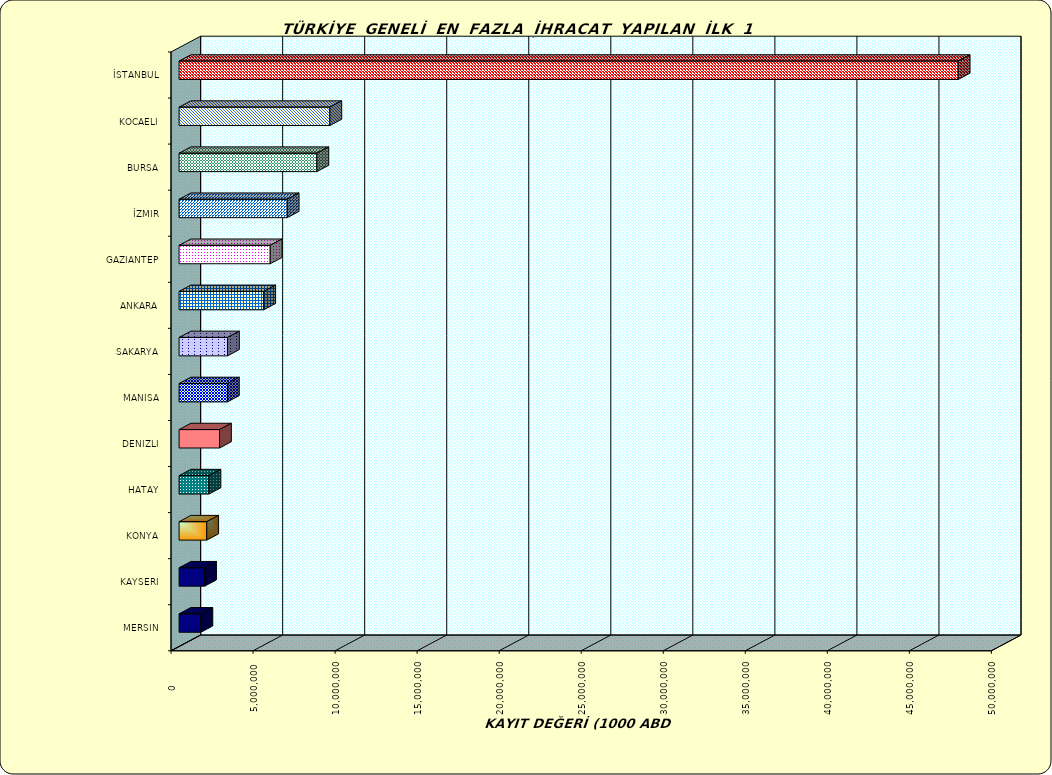
| Category | Series 0 |
|---|---|
| İSTANBUL | 47484035.53 |
| KOCAELI | 9190108.814 |
| BURSA | 8399949.046 |
| İZMIR | 6590576.01 |
| GAZIANTEP | 5554112.767 |
| ANKARA | 5160697.192 |
| SAKARYA | 2951786.517 |
| MANISA | 2945784.421 |
| DENIZLI | 2465183.037 |
| HATAY | 1822208.363 |
| KONYA | 1685656.685 |
| KAYSERI | 1556703.707 |
| MERSIN | 1331956.566 |